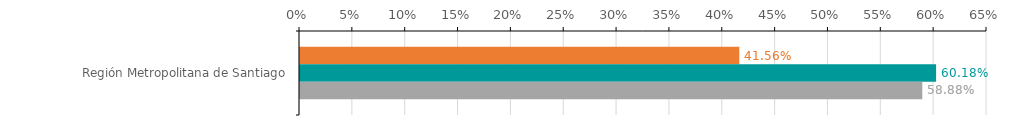
| Category | Numero de operaciones | Monto ($ MM) | Garantia ($ MM) |
|---|---|---|---|
| Región Metropolitana de Santiago | 0.416 | 0.602 | 0.589 |